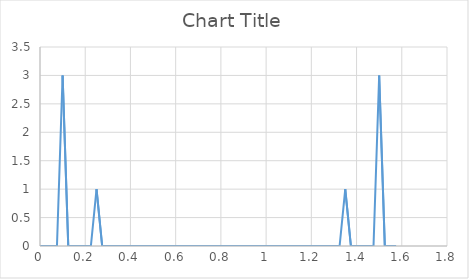
| Category | Series 0 |
|---|---|
| 0.0 | 0 |
| 0.025 | 0 |
| 0.05 | 0 |
| 0.07500000000000001 | 0 |
| 0.1 | 3 |
| 0.125 | 0 |
| 0.15000000000000002 | 0 |
| 0.17500000000000002 | 0 |
| 0.2 | 0 |
| 0.225 | 0 |
| 0.25 | 1 |
| 0.275 | 0 |
| 0.30000000000000004 | 0 |
| 0.325 | 0 |
| 0.35000000000000003 | 0 |
| 0.375 | 0 |
| 0.4 | 0 |
| 0.42500000000000004 | 0 |
| 0.45 | 0 |
| 0.47500000000000003 | 0 |
| 0.5 | 0 |
| 0.525 | 0 |
| 0.55 | 0 |
| 0.5750000000000001 | 0 |
| 0.6000000000000001 | 0 |
| 0.625 | 0 |
| 0.65 | 0 |
| 0.675 | 0 |
| 0.7000000000000001 | 0 |
| 0.7250000000000001 | 0 |
| 0.75 | 0 |
| 0.775 | 0 |
| 0.8 | 0 |
| 0.8250000000000001 | 0 |
| 0.8500000000000001 | 0 |
| 0.875 | 0 |
| 0.9 | 0 |
| 0.925 | 0 |
| 0.9500000000000001 | 0 |
| 0.9750000000000001 | 0 |
| 1.0 | 0 |
| 1.0250000000000001 | 0 |
| 1.05 | 0 |
| 1.075 | 0 |
| 1.1 | 0 |
| 1.125 | 0 |
| 1.1500000000000001 | 0 |
| 1.175 | 0 |
| 1.2000000000000002 | 0 |
| 1.225 | 0 |
| 1.25 | 0 |
| 1.2750000000000001 | 0 |
| 1.3 | 0 |
| 1.3250000000000002 | 0 |
| 1.35 | 1 |
| 1.375 | 0 |
| 1.4000000000000001 | 0 |
| 1.425 | 0 |
| 1.4500000000000002 | 0 |
| 1.475 | 0 |
| 1.5 | 3 |
| 1.5250000000000001 | 0 |
| 1.55 | 0 |
| 1.5750000000000002 | 0 |